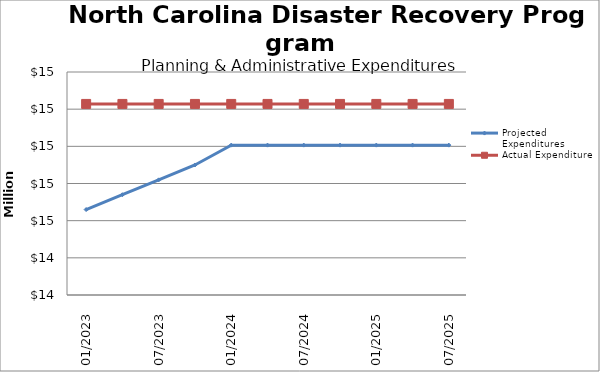
| Category | Projected Expenditures | Actual Expenditure |
|---|---|---|
| 01/2023 | 14659672.2 | 15228219 |
| 4/2023 | 14739672.2 | 15228219 |
| 07/2023 | 14819672.2 | 15228218.87 |
| 10/2023 | 14899672.2 | 15228218.87 |
| 01/2024 | 15006450.2 | 15228218.87 |
| 4/2024 | 15006450.2 | 15228218.87 |
| 07/2024 | 15006450.2 | 15228218.87 |
| 10/2024 | 15006450.2 | 15228218.87 |
| 01/2025 | 15006450.2 | 15228218.87 |
| 4/2025 | 15006450.2 | 15228218.87 |
| 07/2025 | 15006450.2 | 15228218.87 |